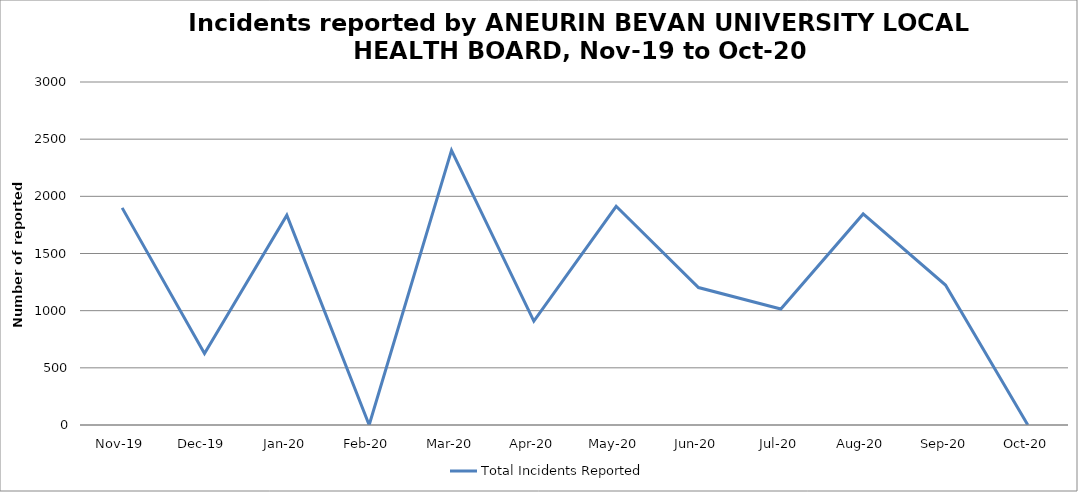
| Category | Total Incidents Reported |
|---|---|
| Nov-19 | 1899 |
| Dec-19 | 625 |
| Jan-20 | 1835 |
| Feb-20 | 0 |
| Mar-20 | 2402 |
| Apr-20 | 908 |
| May-20 | 1913 |
| Jun-20 | 1202 |
| Jul-20 | 1014 |
| Aug-20 | 1846 |
| Sep-20 | 1224 |
| Oct-20 | 0 |